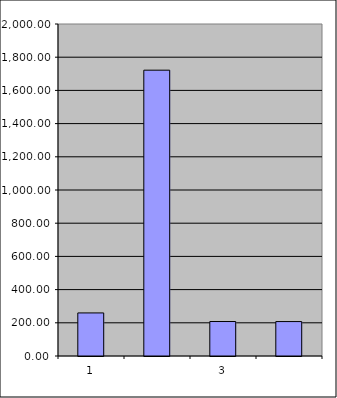
| Category | Series 0 |
|---|---|
| 0 | 259.5 |
| 1 | 1721.776 |
| 2 | 207.692 |
| 3 | 207.446 |